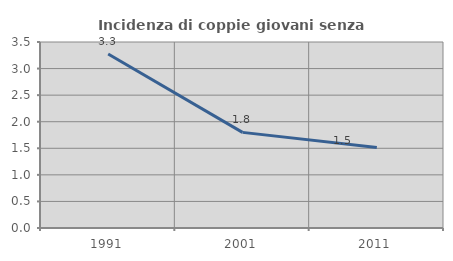
| Category | Incidenza di coppie giovani senza figli |
|---|---|
| 1991.0 | 3.275 |
| 2001.0 | 1.799 |
| 2011.0 | 1.514 |